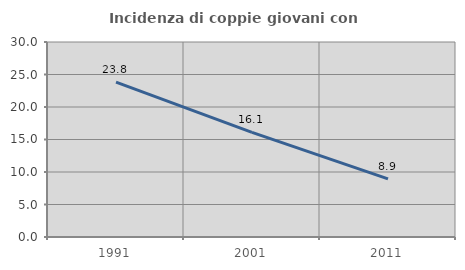
| Category | Incidenza di coppie giovani con figli |
|---|---|
| 1991.0 | 23.837 |
| 2001.0 | 16.107 |
| 2011.0 | 8.94 |